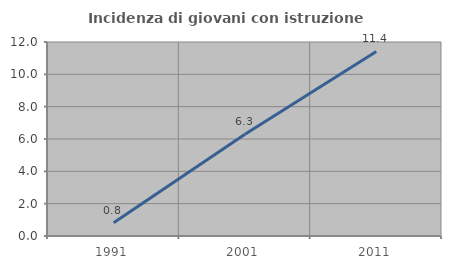
| Category | Incidenza di giovani con istruzione universitaria |
|---|---|
| 1991.0 | 0.826 |
| 2001.0 | 6.294 |
| 2011.0 | 11.414 |